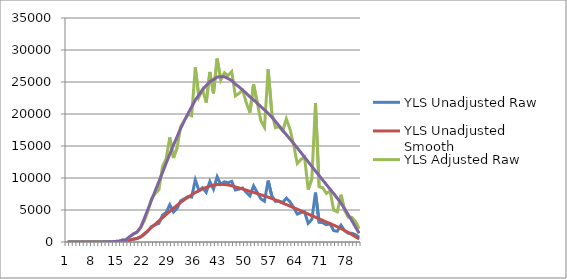
| Category | YLS Unadjusted Raw | YLS Unadjusted Smooth | YLS Adjusted Raw | YLS Adjusted Smooth |
|---|---|---|---|---|
| 0 | 0 | 0 | 0 | 0 |
| 1 | 0 | 0 | 0 | 0 |
| 2 | 0 | 0 | 0 | 0 |
| 3 | 0 | 0 | 0 | 0 |
| 4 | 0 | 0 | 0 | 0 |
| 5 | 0 | 0 | 0 | 0 |
| 6 | 1.359 | 0 | 3.82 | 0 |
| 7 | 0 | 0 | 0 | 0 |
| 8 | 1.915 | 0 | 5.38 | 0 |
| 9 | 3.022 | 0 | 8.491 | 0 |
| 10 | 9.689 | 9.689 | 27.226 | 27.789 |
| 11 | 16.151 | 16.151 | 45.386 | 46.324 |
| 12 | 11.341 | 11.341 | 31.869 | 32.527 |
| 13 | 32.652 | 32.652 | 91.754 | 93.65 |
| 14 | 40.761 | 40.761 | 114.538 | 116.906 |
| 15 | 107.874 | 107.874 | 303.128 | 309.395 |
| 16 | 119.651 | 119.651 | 336.224 | 343.175 |
| 17 | 294.02 | 294.02 | 826.205 | 843.286 |
| 18 | 438.993 | 438.993 | 1233.583 | 1259.087 |
| 19 | 540.895 | 540.895 | 1519.93 | 1551.353 |
| 20 | 796.665 | 796.665 | 2238.652 | 2284.934 |
| 21 | 1177.328 | 1283.952 | 3308.326 | 3682.533 |
| 22 | 1710.991 | 1783.854 | 4807.934 | 5116.316 |
| 23 | 2431.671 | 2287.431 | 6833.066 | 6560.636 |
| 24 | 2686.269 | 2792.861 | 7548.494 | 8010.272 |
| 25 | 2908.41 | 3289.692 | 8172.717 | 9435.245 |
| 26 | 4196.743 | 3781.144 | 11792.97 | 10844.79 |
| 27 | 4625.504 | 4293.377 | 12997.801 | 12313.937 |
| 28 | 5814.925 | 4788.796 | 16340.108 | 13734.861 |
| 29 | 4673.5 | 5272.898 | 13132.671 | 15123.325 |
| 30 | 5240.803 | 5740.191 | 14726.809 | 16463.581 |
| 31 | 6439.943 | 6202.238 | 18096.427 | 17788.79 |
| 32 | 6757.659 | 6605.107 | 18989.218 | 18944.266 |
| 33 | 7108.48 | 6996.887 | 19975.036 | 20067.94 |
| 34 | 7019.677 | 7360.659 | 19725.497 | 21111.283 |
| 35 | 9704.82 | 7729.27 | 27270.826 | 22168.506 |
| 36 | 8057.586 | 8016.015 | 22642.051 | 22990.925 |
| 37 | 8473.307 | 8297.264 | 23810.239 | 23797.584 |
| 38 | 7759.604 | 8524.768 | 21804.713 | 24450.091 |
| 39 | 9455.601 | 8733.859 | 26570.514 | 25049.79 |
| 40 | 8260.46 | 8849.577 | 23212.133 | 25381.685 |
| 41 | 10199.76 | 8984.664 | 28661.622 | 25769.131 |
| 42 | 9012.877 | 9007.425 | 25326.447 | 25834.412 |
| 43 | 9410.079 | 8997.441 | 26442.596 | 25805.778 |
| 44 | 9259.529 | 8905.184 | 26019.546 | 25541.173 |
| 45 | 9475.266 | 8794.582 | 26625.773 | 25223.953 |
| 46 | 8123.117 | 8598.77 | 22826.195 | 24662.34 |
| 47 | 8262.349 | 8450.326 | 23217.441 | 24236.583 |
| 48 | 8435.786 | 8279.031 | 23704.804 | 23745.289 |
| 49 | 7749.917 | 8101.493 | 21777.492 | 23236.088 |
| 50 | 7196.871 | 7910.094 | 20223.417 | 22687.13 |
| 51 | 8764.883 | 7746.077 | 24629.576 | 22216.71 |
| 52 | 7750.064 | 7563.276 | 21777.905 | 21692.414 |
| 53 | 6738.469 | 7377.534 | 18935.294 | 21159.683 |
| 54 | 6375.722 | 7197.685 | 17915.964 | 20643.854 |
| 55 | 9591.885 | 7014.259 | 26953.476 | 20117.765 |
| 56 | 7209.7 | 6803.448 | 20259.467 | 19513.133 |
| 57 | 6351.751 | 6573.74 | 17848.605 | 18854.303 |
| 58 | 6405.968 | 6333.637 | 18000.956 | 18165.656 |
| 59 | 6170.449 | 6085.84 | 17339.141 | 17454.945 |
| 60 | 6847.053 | 5845.393 | 19240.418 | 16765.312 |
| 61 | 6278.219 | 5608.079 | 17641.978 | 16084.667 |
| 62 | 5397.69 | 5368.629 | 15167.666 | 15397.893 |
| 63 | 4363.534 | 5124.508 | 12261.657 | 14697.726 |
| 64 | 4587.792 | 4877.844 | 12891.829 | 13990.262 |
| 65 | 4724.906 | 4622.224 | 13277.123 | 13257.112 |
| 66 | 2914.266 | 4369.863 | 8189.172 | 12533.309 |
| 67 | 3520.518 | 4118.034 | 9892.758 | 11811.034 |
| 68 | 7723.009 | 3868.57 | 21701.88 | 11095.539 |
| 69 | 3078.363 | 3619.313 | 8650.29 | 10380.639 |
| 70 | 3011.462 | 3371.746 | 8462.296 | 9670.585 |
| 71 | 2698.723 | 3123.137 | 7583.49 | 8957.546 |
| 72 | 2845.846 | 2884.835 | 7996.91 | 8274.065 |
| 73 | 1774.287 | 2639.145 | 4985.798 | 7569.396 |
| 74 | 1680.386 | 2382.48 | 4721.934 | 6833.248 |
| 75 | 2629.714 | 2111.512 | 7389.573 | 6056.079 |
| 76 | 1763.28 | 1814.672 | 4954.868 | 5204.705 |
| 77 | 1378.475 | 1483.335 | 3873.555 | 4254.39 |
| 78 | 1368.694 | 1154.958 | 3846.07 | 3312.563 |
| 79 | 1134.784 | 813.563 | 3188.776 | 2333.4 |
| 80 | 743.622 | 472.168 | 2089.599 | 1354.238 |